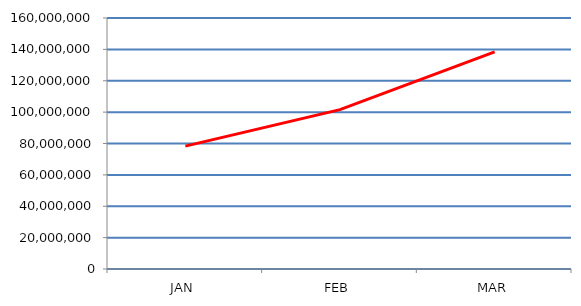
| Category | Series 0 |
|---|---|
| JAN | 78313482 |
| FEB | 101615529 |
| MAR | 138348218 |